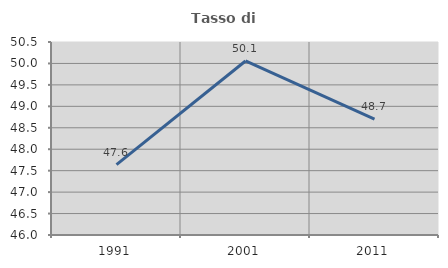
| Category | Tasso di occupazione   |
|---|---|
| 1991.0 | 47.64 |
| 2001.0 | 50.057 |
| 2011.0 | 48.703 |